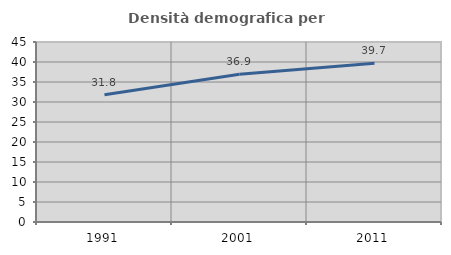
| Category | Densità demografica |
|---|---|
| 1991.0 | 31.798 |
| 2001.0 | 36.925 |
| 2011.0 | 39.688 |